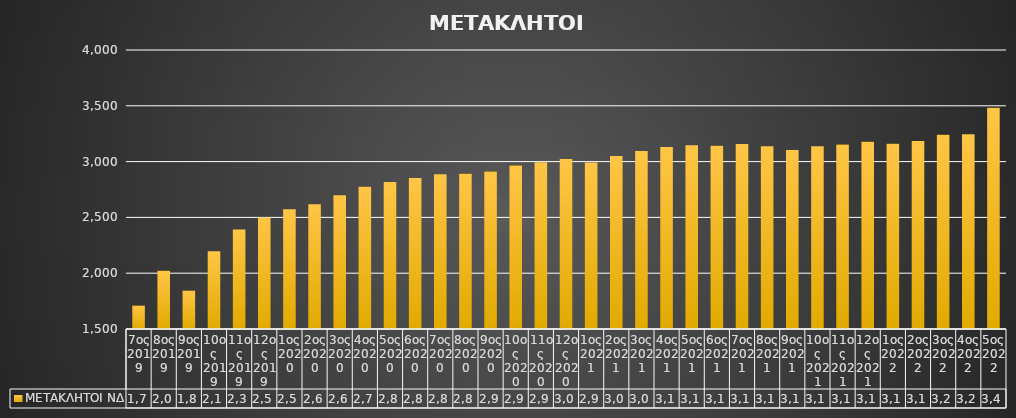
| Category | ΜΕΤΑΚΛΗΤΟΙ ΝΔ |
|---|---|
| 7ος 2019 | 1710 |
| 8ος 2019 | 2022 |
| 9ος 2019 | 1844 |
| 10ος 2019 | 2196 |
| 11ος 2019 | 2392 |
| 12ος 2019 | 2500 |
| 1ος 2020 | 2572 |
| 2ος 2020 | 2618 |
| 3ος 2020 | 2699 |
| 4ος 2020 | 2774 |
| 5ος 2020 | 2817 |
| 6ος 2020 | 2853 |
| 7ος 2020 | 2886 |
| 8ος 2020 | 2892 |
| 9ος 2020 | 2911 |
| 10ος 2020 | 2965 |
| 11ος 2020 | 2994 |
| 12ος 2020 | 3024 |
| 1ος 2021 | 2993 |
| 2ος 2021 | 3051 |
| 3ος 2021 | 3096 |
| 4ος 2021 | 3131 |
| 5ος 2021 | 3146 |
| 6ος 2021 | 3141 |
| 7ος 2021 | 3158 |
| 8ος 2021 | 3137 |
| 9ος 2021 | 3104 |
| 10ος 2021 | 3138 |
| 11ος 2021 | 3153 |
| 12ος 2021 | 3177 |
| 1ος 2022 | 3161 |
| 2ος 2022 | 3184 |
| 3ος 2022 | 3240 |
| 4ος 2022 | 3245 |
| 5ος 2022 | 3483 |